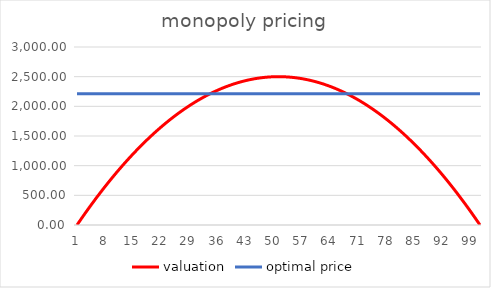
| Category | valuation | optimal price |
|---|---|---|
| 0 | 0 | 2211 |
| 1 | 99 | 2211 |
| 2 | 196 | 2211 |
| 3 | 291 | 2211 |
| 4 | 384 | 2211 |
| 5 | 475 | 2211 |
| 6 | 564 | 2211 |
| 7 | 651 | 2211 |
| 8 | 736 | 2211 |
| 9 | 819 | 2211 |
| 10 | 900 | 2211 |
| 11 | 979 | 2211 |
| 12 | 1056 | 2211 |
| 13 | 1131 | 2211 |
| 14 | 1204 | 2211 |
| 15 | 1275 | 2211 |
| 16 | 1344 | 2211 |
| 17 | 1411 | 2211 |
| 18 | 1476 | 2211 |
| 19 | 1539 | 2211 |
| 20 | 1600 | 2211 |
| 21 | 1659 | 2211 |
| 22 | 1716 | 2211 |
| 23 | 1771 | 2211 |
| 24 | 1824 | 2211 |
| 25 | 1875 | 2211 |
| 26 | 1924 | 2211 |
| 27 | 1971 | 2211 |
| 28 | 2016 | 2211 |
| 29 | 2059 | 2211 |
| 30 | 2100 | 2211 |
| 31 | 2139 | 2211 |
| 32 | 2176 | 2211 |
| 33 | 2211 | 2211 |
| 34 | 2244 | 2211 |
| 35 | 2275 | 2211 |
| 36 | 2304 | 2211 |
| 37 | 2331 | 2211 |
| 38 | 2356 | 2211 |
| 39 | 2379 | 2211 |
| 40 | 2400 | 2211 |
| 41 | 2419 | 2211 |
| 42 | 2436 | 2211 |
| 43 | 2451 | 2211 |
| 44 | 2464 | 2211 |
| 45 | 2475 | 2211 |
| 46 | 2484 | 2211 |
| 47 | 2491 | 2211 |
| 48 | 2496 | 2211 |
| 49 | 2499 | 2211 |
| 50 | 2500 | 2211 |
| 51 | 2499 | 2211 |
| 52 | 2496 | 2211 |
| 53 | 2491 | 2211 |
| 54 | 2484 | 2211 |
| 55 | 2475 | 2211 |
| 56 | 2464 | 2211 |
| 57 | 2451 | 2211 |
| 58 | 2436 | 2211 |
| 59 | 2419 | 2211 |
| 60 | 2400 | 2211 |
| 61 | 2379 | 2211 |
| 62 | 2356 | 2211 |
| 63 | 2331 | 2211 |
| 64 | 2304 | 2211 |
| 65 | 2275 | 2211 |
| 66 | 2244 | 2211 |
| 67 | 2211 | 2211 |
| 68 | 2176 | 2211 |
| 69 | 2139 | 2211 |
| 70 | 2100 | 2211 |
| 71 | 2059 | 2211 |
| 72 | 2016 | 2211 |
| 73 | 1971 | 2211 |
| 74 | 1924 | 2211 |
| 75 | 1875 | 2211 |
| 76 | 1824 | 2211 |
| 77 | 1771 | 2211 |
| 78 | 1716 | 2211 |
| 79 | 1659 | 2211 |
| 80 | 1600 | 2211 |
| 81 | 1539 | 2211 |
| 82 | 1476 | 2211 |
| 83 | 1411 | 2211 |
| 84 | 1344 | 2211 |
| 85 | 1275 | 2211 |
| 86 | 1204 | 2211 |
| 87 | 1131 | 2211 |
| 88 | 1056 | 2211 |
| 89 | 979 | 2211 |
| 90 | 900 | 2211 |
| 91 | 819 | 2211 |
| 92 | 736 | 2211 |
| 93 | 651 | 2211 |
| 94 | 564 | 2211 |
| 95 | 475 | 2211 |
| 96 | 384 | 2211 |
| 97 | 291 | 2211 |
| 98 | 196 | 2211 |
| 99 | 99 | 2211 |
| 100 | 0 | 2211 |